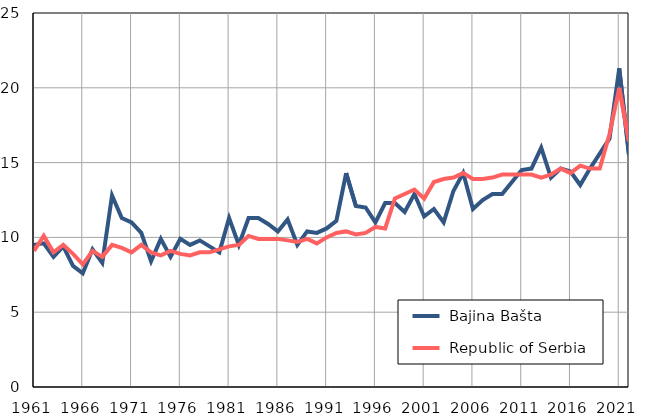
| Category |  Bajina Bašta |  Republic of Serbia |
|---|---|---|
| 1961.0 | 9.5 | 9.1 |
| 1962.0 | 9.6 | 10.1 |
| 1963.0 | 8.7 | 9 |
| 1964.0 | 9.4 | 9.5 |
| 1965.0 | 8.1 | 8.9 |
| 1966.0 | 7.6 | 8.2 |
| 1967.0 | 9.2 | 9.1 |
| 1968.0 | 8.3 | 8.7 |
| 1969.0 | 12.8 | 9.5 |
| 1970.0 | 11.3 | 9.3 |
| 1971.0 | 11 | 9 |
| 1972.0 | 10.3 | 9.5 |
| 1973.0 | 8.4 | 9 |
| 1974.0 | 9.9 | 8.8 |
| 1975.0 | 8.7 | 9.1 |
| 1976.0 | 9.9 | 8.9 |
| 1977.0 | 9.5 | 8.8 |
| 1978.0 | 9.8 | 9 |
| 1979.0 | 9.4 | 9 |
| 1980.0 | 9 | 9.2 |
| 1981.0 | 11.3 | 9.4 |
| 1982.0 | 9.5 | 9.5 |
| 1983.0 | 11.3 | 10.1 |
| 1984.0 | 11.3 | 9.9 |
| 1985.0 | 10.9 | 9.9 |
| 1986.0 | 10.4 | 9.9 |
| 1987.0 | 11.2 | 9.8 |
| 1988.0 | 9.5 | 9.7 |
| 1989.0 | 10.4 | 9.9 |
| 1990.0 | 10.3 | 9.6 |
| 1991.0 | 10.6 | 10 |
| 1992.0 | 11.1 | 10.3 |
| 1993.0 | 14.3 | 10.4 |
| 1994.0 | 12.1 | 10.2 |
| 1995.0 | 12 | 10.3 |
| 1996.0 | 11 | 10.7 |
| 1997.0 | 12.3 | 10.6 |
| 1998.0 | 12.3 | 12.6 |
| 1999.0 | 11.7 | 12.9 |
| 2000.0 | 12.9 | 13.2 |
| 2001.0 | 11.4 | 12.6 |
| 2002.0 | 11.9 | 13.7 |
| 2003.0 | 11 | 13.9 |
| 2004.0 | 13.1 | 14 |
| 2005.0 | 14.3 | 14.3 |
| 2006.0 | 11.9 | 13.9 |
| 2007.0 | 12.5 | 13.9 |
| 2008.0 | 12.9 | 14 |
| 2009.0 | 12.9 | 14.2 |
| 2010.0 | 13.7 | 14.2 |
| 2011.0 | 14.5 | 14.2 |
| 2012.0 | 14.6 | 14.2 |
| 2013.0 | 16 | 14 |
| 2014.0 | 14 | 14.2 |
| 2015.0 | 14.6 | 14.6 |
| 2016.0 | 14.4 | 14.3 |
| 2017.0 | 13.5 | 14.8 |
| 2018.0 | 14.6 | 14.6 |
| 2019.0 | 15.6 | 14.6 |
| 2020.0 | 16.6 | 16.9 |
| 2021.0 | 21.3 | 20 |
| 2022.0 | 15.5 | 16.4 |